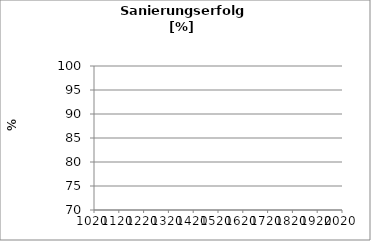
| Category | Series 1 |
|---|---|
| 1998.0 | 0 |
| 1999.0 | 0 |
| 2000.0 | 0 |
| 2001.0 | 0 |
| 2002.0 | 0 |
| 2003.0 | 0 |
| 2004.0 | 0 |
| 2005.0 | 0 |
| 2006.0 | 0 |
| 2007.0 | 0 |
| 2008.0 | 0 |
| 2009.0 | 0 |
| 2010.0 | 0 |
| 2011.0 | 0 |
| 2012.0 | 0 |
| 2013.0 | 0 |
| 2014.0 | 0 |
| 2015.0 | 0 |
| 2016.0 | 0 |
| 2017.0 | 0 |
| 2018.0 | 0 |
| 2019.0 | 0 |
| 2020.0 | 0 |